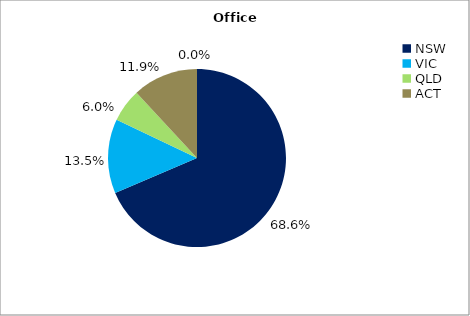
| Category | Series 0 |
|---|---|
| NSW | 0.686 |
| VIC | 0.135 |
| QLD | 0.06 |
| ACT | 0.119 |